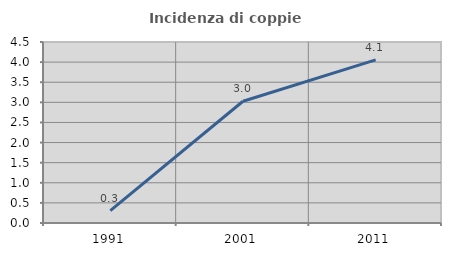
| Category | Incidenza di coppie miste |
|---|---|
| 1991.0 | 0.306 |
| 2001.0 | 3.026 |
| 2011.0 | 4.055 |